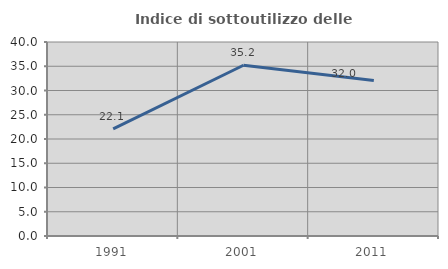
| Category | Indice di sottoutilizzo delle abitazioni  |
|---|---|
| 1991.0 | 22.09 |
| 2001.0 | 35.211 |
| 2011.0 | 32.047 |